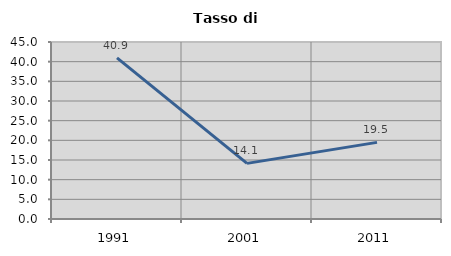
| Category | Tasso di disoccupazione   |
|---|---|
| 1991.0 | 40.95 |
| 2001.0 | 14.139 |
| 2011.0 | 19.482 |